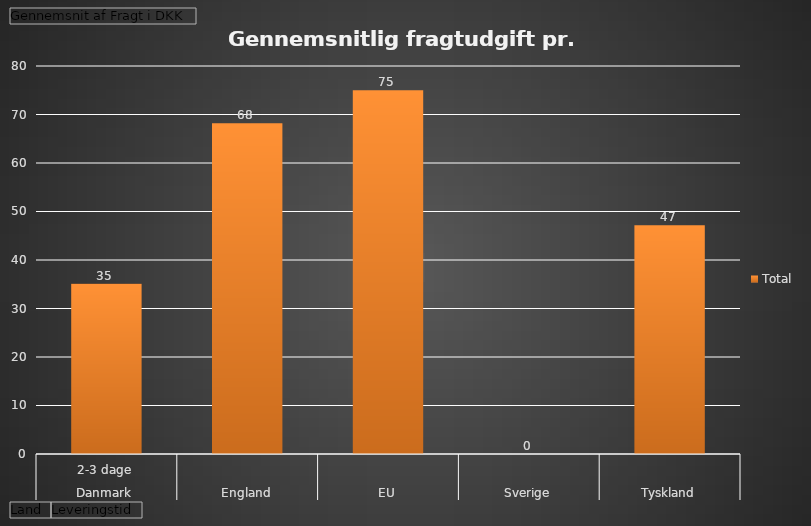
| Category | Total |
|---|---|
| 0 | 35.124 |
| 1 | 68.177 |
| 2 | 75 |
| 3 | 0 |
| 4 | 47.149 |